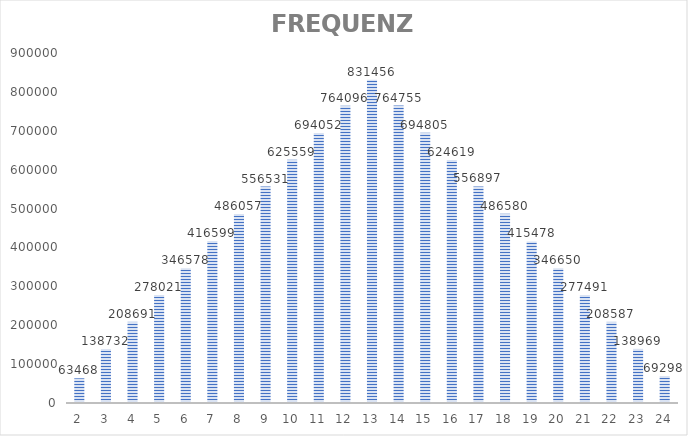
| Category | Series 1 |
|---|---|
| 2.0 | 63468 |
| 3.0 | 138732 |
| 4.0 | 208691 |
| 5.0 | 278021 |
| 6.0 | 346578 |
| 7.0 | 416599 |
| 8.0 | 486057 |
| 9.0 | 556531 |
| 10.0 | 625559 |
| 11.0 | 694052 |
| 12.0 | 764096 |
| 13.0 | 831456 |
| 14.0 | 764755 |
| 15.0 | 694805 |
| 16.0 | 624619 |
| 17.0 | 556897 |
| 18.0 | 486580 |
| 19.0 | 415478 |
| 20.0 | 346650 |
| 21.0 | 277491 |
| 22.0 | 208587 |
| 23.0 | 138969 |
| 24.0 | 69298 |